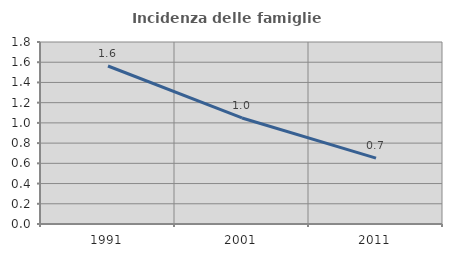
| Category | Incidenza delle famiglie numerose |
|---|---|
| 1991.0 | 1.562 |
| 2001.0 | 1.049 |
| 2011.0 | 0.651 |